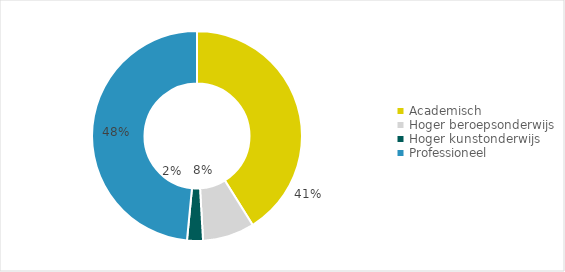
| Category | Series 1 |
|---|---|
| Academisch | 0.411 |
| Hoger beroepsonderwijs | 0.08 |
| Hoger kunstonderwijs | 0.024 |
| Professioneel | 0.485 |